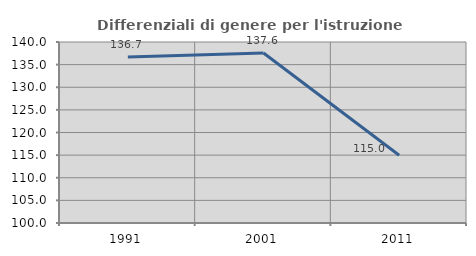
| Category | Differenziali di genere per l'istruzione superiore |
|---|---|
| 1991.0 | 136.677 |
| 2001.0 | 137.558 |
| 2011.0 | 114.965 |